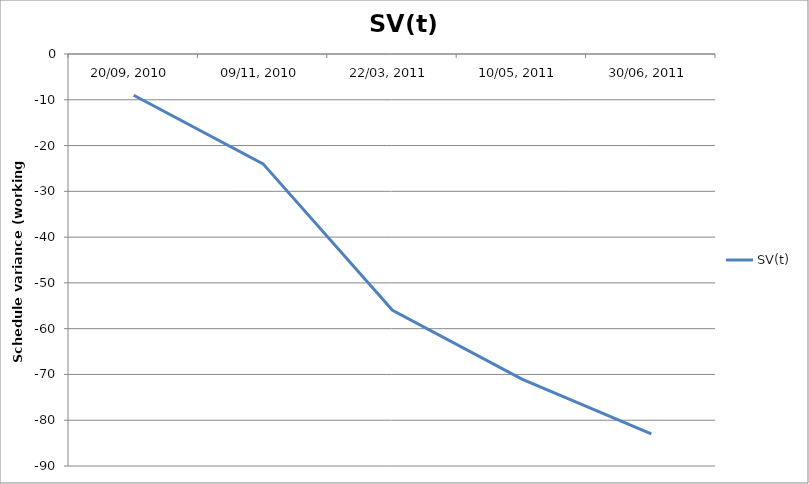
| Category | SV(t) |
|---|---|
| 20/09, 2010 | -9 |
| 09/11, 2010 | -24 |
| 22/03, 2011 | -56 |
| 10/05, 2011 | -71 |
| 30/06, 2011 | -83 |